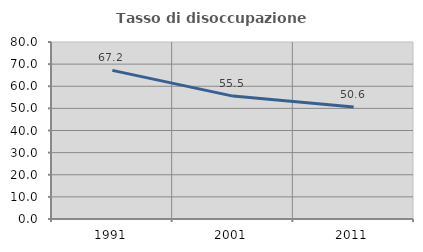
| Category | Tasso di disoccupazione giovanile  |
|---|---|
| 1991.0 | 67.174 |
| 2001.0 | 55.548 |
| 2011.0 | 50.627 |